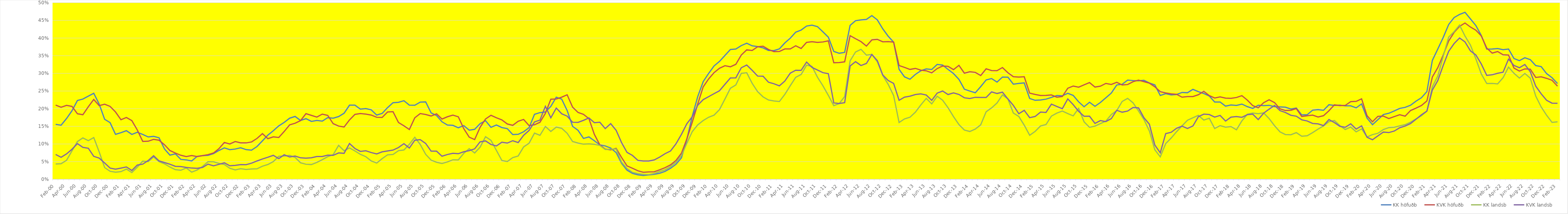
| Category | KK höfuðb | KVK höfuðb | KK landsb | KVK landsb |
|---|---|---|---|---|
| Feb-00 | 0.156 | 0.21 | 0.043 | 0.07 |
| Mar-00 | 0.153 | 0.204 | 0.044 | 0.062 |
| Apr-00 | 0.172 | 0.209 | 0.054 | 0.072 |
| May-00 | 0.194 | 0.206 | 0.081 | 0.085 |
| Jun-00 | 0.223 | 0.186 | 0.107 | 0.101 |
| Jul-00 | 0.227 | 0.183 | 0.117 | 0.09 |
| Aug-00 | 0.235 | 0.205 | 0.109 | 0.088 |
| Sep-00 | 0.244 | 0.226 | 0.118 | 0.065 |
| Oct-00 | 0.213 | 0.209 | 0.077 | 0.06 |
| Nov-00 | 0.17 | 0.213 | 0.033 | 0.046 |
| Dec-00 | 0.16 | 0.206 | 0.023 | 0.032 |
| Jan-01 | 0.127 | 0.191 | 0.02 | 0.029 |
| Feb-01 | 0.132 | 0.169 | 0.022 | 0.032 |
| Mar-01 | 0.138 | 0.175 | 0.029 | 0.035 |
| Apr-01 | 0.127 | 0.166 | 0.019 | 0.025 |
| May-01 | 0.133 | 0.14 | 0.034 | 0.04 |
| Jun-01 | 0.127 | 0.107 | 0.051 | 0.043 |
| Jul-01 | 0.12 | 0.108 | 0.05 | 0.053 |
| Aug-01 | 0.122 | 0.113 | 0.063 | 0.067 |
| Sep-01 | 0.118 | 0.111 | 0.05 | 0.052 |
| Oct-01 | 0.086 | 0.098 | 0.044 | 0.047 |
| Nov-01 | 0.068 | 0.081 | 0.035 | 0.043 |
| Dec-01 | 0.072 | 0.074 | 0.027 | 0.037 |
| Jan-02 | 0.056 | 0.068 | 0.026 | 0.036 |
| Feb-02 | 0.055 | 0.064 | 0.032 | 0.034 |
| Mar-02 | 0.052 | 0.067 | 0.02 | 0.032 |
| Apr-02 | 0.065 | 0.064 | 0.026 | 0.031 |
| May-02 | 0.067 | 0.067 | 0.037 | 0.034 |
| Jun-02 | 0.068 | 0.07 | 0.05 | 0.043 |
| Jul-02 | 0.073 | 0.074 | 0.05 | 0.038 |
| Aug-02 | 0.082 | 0.087 | 0.045 | 0.042 |
| Sep-02 | 0.089 | 0.104 | 0.042 | 0.047 |
| Oct-02 | 0.084 | 0.1 | 0.031 | 0.038 |
| Nov-02 | 0.086 | 0.107 | 0.027 | 0.039 |
| Dec-02 | 0.089 | 0.103 | 0.03 | 0.042 |
| Jan-03 | 0.084 | 0.103 | 0.028 | 0.042 |
| Feb-03 | 0.083 | 0.106 | 0.029 | 0.046 |
| Mar-03 | 0.093 | 0.116 | 0.03 | 0.052 |
| Apr-03 | 0.109 | 0.129 | 0.037 | 0.058 |
| May-03 | 0.125 | 0.115 | 0.042 | 0.062 |
| Jun-03 | 0.138 | 0.12 | 0.05 | 0.068 |
| Jul-03 | 0.151 | 0.118 | 0.065 | 0.059 |
| Aug-03 | 0.161 | 0.135 | 0.066 | 0.069 |
| Sep-03 | 0.173 | 0.154 | 0.068 | 0.063 |
| Oct-03 | 0.178 | 0.159 | 0.062 | 0.066 |
| Nov-03 | 0.167 | 0.166 | 0.047 | 0.061 |
| Dec-03 | 0.172 | 0.186 | 0.043 | 0.06 |
| Jan-04 | 0.164 | 0.181 | 0.042 | 0.061 |
| Feb-04 | 0.167 | 0.176 | 0.048 | 0.064 |
| Mar-04 | 0.165 | 0.185 | 0.056 | 0.065 |
| Apr-04 | 0.175 | 0.181 | 0.064 | 0.068 |
| May-04 | 0.173 | 0.158 | 0.07 | 0.068 |
| Jun-04 | 0.178 | 0.151 | 0.096 | 0.075 |
| Jul-04 | 0.187 | 0.148 | 0.081 | 0.074 |
| Aug-04 | 0.21 | 0.168 | 0.089 | 0.101 |
| Sep-04 | 0.21 | 0.184 | 0.08 | 0.087 |
| Oct-04 | 0.199 | 0.186 | 0.071 | 0.079 |
| Nov-04 | 0.2 | 0.185 | 0.064 | 0.081 |
| Dec-04 | 0.197 | 0.182 | 0.052 | 0.076 |
| Jan-05 | 0.182 | 0.176 | 0.046 | 0.072 |
| Feb-05 | 0.187 | 0.175 | 0.059 | 0.078 |
| Mar-05 | 0.203 | 0.191 | 0.069 | 0.08 |
| Apr-05 | 0.217 | 0.191 | 0.07 | 0.083 |
| May-05 | 0.218 | 0.161 | 0.081 | 0.09 |
| Jun-05 | 0.223 | 0.151 | 0.083 | 0.101 |
| Jul-05 | 0.21 | 0.141 | 0.099 | 0.089 |
| Aug-05 | 0.21 | 0.174 | 0.119 | 0.111 |
| Sep-05 | 0.219 | 0.186 | 0.099 | 0.112 |
| Oct-05 | 0.219 | 0.184 | 0.071 | 0.102 |
| Nov-05 | 0.188 | 0.179 | 0.054 | 0.08 |
| Dec-05 | 0.181 | 0.185 | 0.048 | 0.08 |
| Jan-06 | 0.163 | 0.171 | 0.045 | 0.065 |
| Feb-06 | 0.154 | 0.177 | 0.049 | 0.07 |
| Mar-06 | 0.153 | 0.182 | 0.055 | 0.074 |
| Apr-06 | 0.146 | 0.177 | 0.055 | 0.072 |
| May-06 | 0.152 | 0.143 | 0.074 | 0.078 |
| Jun-06 | 0.139 | 0.119 | 0.087 | 0.081 |
| Jul-06 | 0.142 | 0.113 | 0.075 | 0.086 |
| Aug-06 | 0.158 | 0.147 | 0.091 | 0.106 |
| Sep-06 | 0.166 | 0.171 | 0.121 | 0.109 |
| Oct-06 | 0.147 | 0.181 | 0.11 | 0.099 |
| Nov-06 | 0.154 | 0.174 | 0.082 | 0.094 |
| Dec-06 | 0.147 | 0.168 | 0.053 | 0.105 |
| Jan-07 | 0.143 | 0.157 | 0.05 | 0.103 |
| Feb-07 | 0.127 | 0.153 | 0.061 | 0.109 |
| Mar-07 | 0.127 | 0.164 | 0.066 | 0.104 |
| Apr-07 | 0.135 | 0.169 | 0.092 | 0.125 |
| May-07 | 0.146 | 0.152 | 0.102 | 0.138 |
| Jun-07 | 0.184 | 0.155 | 0.131 | 0.162 |
| Jul-07 | 0.189 | 0.161 | 0.124 | 0.168 |
| Aug-07 | 0.191 | 0.187 | 0.15 | 0.207 |
| Sep-07 | 0.207 | 0.227 | 0.136 | 0.174 |
| Oct-07 | 0.232 | 0.227 | 0.148 | 0.202 |
| Nov-07 | 0.227 | 0.233 | 0.144 | 0.186 |
| Dec-07 | 0.195 | 0.239 | 0.13 | 0.179 |
| Jan-08 | 0.15 | 0.204 | 0.107 | 0.162 |
| Feb-08 | 0.139 | 0.189 | 0.103 | 0.161 |
| Mar-08 | 0.116 | 0.184 | 0.099 | 0.167 |
| Apr-08 | 0.12 | 0.172 | 0.101 | 0.174 |
| May-08 | 0.109 | 0.127 | 0.099 | 0.16 |
| Jun-08 | 0.098 | 0.098 | 0.096 | 0.162 |
| Jul-08 | 0.094 | 0.085 | 0.084 | 0.144 |
| Aug-08 | 0.089 | 0.083 | 0.085 | 0.158 |
| Sep-08 | 0.076 | 0.088 | 0.086 | 0.139 |
| Oct-08 | 0.045 | 0.062 | 0.048 | 0.104 |
| Nov-08 | 0.026 | 0.038 | 0.03 | 0.076 |
| Dec-08 | 0.017 | 0.031 | 0.02 | 0.068 |
| Jan-09 | 0.013 | 0.024 | 0.016 | 0.054 |
| Feb-09 | 0.011 | 0.02 | 0.014 | 0.052 |
| Mar-09 | 0.012 | 0.021 | 0.013 | 0.052 |
| Apr-09 | 0.014 | 0.021 | 0.016 | 0.055 |
| May-09 | 0.017 | 0.027 | 0.022 | 0.063 |
| Jun-09 | 0.023 | 0.033 | 0.027 | 0.073 |
| Jul-09 | 0.031 | 0.041 | 0.036 | 0.08 |
| Aug-09 | 0.043 | 0.053 | 0.048 | 0.1 |
| Sep-09 | 0.061 | 0.074 | 0.067 | 0.127 |
| Oct-09 | 0.114 | 0.115 | 0.102 | 0.157 |
| Nov-09 | 0.179 | 0.162 | 0.135 | 0.177 |
| Dec-09 | 0.234 | 0.213 | 0.154 | 0.21 |
| Jan-10 | 0.277 | 0.262 | 0.166 | 0.226 |
| Feb-10 | 0.3 | 0.284 | 0.176 | 0.234 |
| Mar-10 | 0.321 | 0.302 | 0.182 | 0.243 |
| Apr-10 | 0.334 | 0.315 | 0.198 | 0.251 |
| May-10 | 0.351 | 0.322 | 0.227 | 0.269 |
| Jun-10 | 0.368 | 0.319 | 0.258 | 0.287 |
| Jul-10 | 0.369 | 0.326 | 0.267 | 0.287 |
| Aug-10 | 0.379 | 0.352 | 0.3 | 0.316 |
| Sep-10 | 0.385 | 0.367 | 0.302 | 0.324 |
| Oct-10 | 0.378 | 0.365 | 0.272 | 0.309 |
| Nov-10 | 0.376 | 0.375 | 0.248 | 0.293 |
| Dec-10 | 0.372 | 0.377 | 0.233 | 0.292 |
| Jan-11 | 0.365 | 0.368 | 0.225 | 0.275 |
| Feb-11 | 0.365 | 0.362 | 0.222 | 0.271 |
| Mar-11 | 0.369 | 0.362 | 0.22 | 0.265 |
| Apr-11 | 0.386 | 0.369 | 0.24 | 0.278 |
| May-11 | 0.4 | 0.369 | 0.265 | 0.301 |
| Jun-11 | 0.417 | 0.378 | 0.289 | 0.309 |
| Jul-11 | 0.423 | 0.37 | 0.297 | 0.308 |
| Aug-11 | 0.434 | 0.388 | 0.323 | 0.332 |
| Sep-11 | 0.436 | 0.39 | 0.32 | 0.317 |
| Oct-11 | 0.432 | 0.388 | 0.289 | 0.309 |
| Nov-11 | 0.418 | 0.389 | 0.265 | 0.302 |
| Dec-11 | 0.402 | 0.392 | 0.238 | 0.299 |
| Jan-12 | 0.362 | 0.33 | 0.209 | 0.216 |
| Feb-12 | 0.357 | 0.331 | 0.215 | 0.215 |
| Mar-12 | 0.359 | 0.333 | 0.234 | 0.217 |
| Apr-12 | 0.436 | 0.407 | 0.336 | 0.321 |
| May-12 | 0.449 | 0.398 | 0.361 | 0.333 |
| Jun-12 | 0.451 | 0.39 | 0.368 | 0.322 |
| Jul-12 | 0.453 | 0.377 | 0.352 | 0.328 |
| Aug-12 | 0.463 | 0.395 | 0.354 | 0.354 |
| Sep-12 | 0.452 | 0.396 | 0.333 | 0.336 |
| Oct-12 | 0.426 | 0.389 | 0.294 | 0.295 |
| Nov-12 | 0.405 | 0.39 | 0.269 | 0.28 |
| Dec-12 | 0.388 | 0.389 | 0.237 | 0.272 |
| Jan-13 | 0.312 | 0.322 | 0.161 | 0.224 |
| Feb-13 | 0.29 | 0.317 | 0.171 | 0.233 |
| Mar-13 | 0.283 | 0.311 | 0.176 | 0.235 |
| Apr-13 | 0.297 | 0.314 | 0.19 | 0.24 |
| May-13 | 0.307 | 0.309 | 0.211 | 0.242 |
| Jun-13 | 0.313 | 0.307 | 0.229 | 0.239 |
| Jul-13 | 0.311 | 0.301 | 0.214 | 0.224 |
| Aug-13 | 0.325 | 0.314 | 0.235 | 0.244 |
| Sep-13 | 0.323 | 0.321 | 0.224 | 0.25 |
| Oct-13 | 0.311 | 0.32 | 0.203 | 0.24 |
| Nov-13 | 0.3 | 0.311 | 0.178 | 0.245 |
| Dec-13 | 0.283 | 0.323 | 0.155 | 0.24 |
| Jan-14 | 0.255 | 0.301 | 0.139 | 0.231 |
| Feb-14 | 0.25 | 0.305 | 0.135 | 0.229 |
| Mar-14 | 0.245 | 0.303 | 0.142 | 0.232 |
| Apr-14 | 0.262 | 0.294 | 0.154 | 0.232 |
| May-14 | 0.281 | 0.313 | 0.191 | 0.232 |
| Jun-14 | 0.285 | 0.308 | 0.202 | 0.248 |
| Jul-14 | 0.275 | 0.308 | 0.216 | 0.243 |
| Aug-14 | 0.289 | 0.316 | 0.239 | 0.247 |
| Sep-14 | 0.289 | 0.302 | 0.227 | 0.228 |
| Oct-14 | 0.269 | 0.291 | 0.188 | 0.209 |
| Nov-14 | 0.272 | 0.289 | 0.178 | 0.186 |
| Dec-14 | 0.273 | 0.29 | 0.153 | 0.195 |
| Jan-15 | 0.229 | 0.244 | 0.125 | 0.174 |
| Feb-15 | 0.224 | 0.24 | 0.136 | 0.178 |
| Mar-15 | 0.225 | 0.237 | 0.151 | 0.19 |
| Apr-15 | 0.227 | 0.238 | 0.155 | 0.189 |
| May-15 | 0.232 | 0.239 | 0.179 | 0.213 |
| Jun-15 | 0.237 | 0.232 | 0.188 | 0.206 |
| Jul-15 | 0.236 | 0.234 | 0.193 | 0.2 |
| Aug-15 | 0.244 | 0.258 | 0.186 | 0.228 |
| Sep-15 | 0.238 | 0.264 | 0.18 | 0.211 |
| Oct-15 | 0.219 | 0.261 | 0.201 | 0.192 |
| Nov-15 | 0.206 | 0.268 | 0.163 | 0.178 |
| Dec-15 | 0.218 | 0.274 | 0.147 | 0.179 |
| Jan-16 | 0.207 | 0.261 | 0.151 | 0.158 |
| Feb-16 | 0.218 | 0.264 | 0.158 | 0.166 |
| Mar-16 | 0.231 | 0.272 | 0.165 | 0.163 |
| Apr-16 | 0.244 | 0.269 | 0.183 | 0.172 |
| May-16 | 0.267 | 0.275 | 0.194 | 0.195 |
| Jun-16 | 0.269 | 0.267 | 0.22 | 0.19 |
| Jul-16 | 0.281 | 0.268 | 0.229 | 0.193 |
| Aug-16 | 0.28 | 0.276 | 0.217 | 0.203 |
| Sep-16 | 0.279 | 0.281 | 0.193 | 0.202 |
| Oct-16 | 0.28 | 0.277 | 0.169 | 0.174 |
| Nov-16 | 0.273 | 0.272 | 0.137 | 0.156 |
| Dec-16 | 0.267 | 0.262 | 0.084 | 0.097 |
| Jan-17 | 0.237 | 0.248 | 0.064 | 0.075 |
| Feb-17 | 0.243 | 0.244 | 0.101 | 0.129 |
| Mar-17 | 0.239 | 0.242 | 0.117 | 0.133 |
| Apr-17 | 0.24 | 0.241 | 0.135 | 0.144 |
| May-17 | 0.246 | 0.233 | 0.151 | 0.151 |
| Jun-17 | 0.245 | 0.234 | 0.167 | 0.144 |
| Jul-17 | 0.255 | 0.234 | 0.174 | 0.151 |
| Aug-17 | 0.248 | 0.239 | 0.181 | 0.177 |
| Sep-17 | 0.243 | 0.249 | 0.168 | 0.184 |
| Oct-17 | 0.236 | 0.237 | 0.173 | 0.183 |
| Nov-17 | 0.219 | 0.23 | 0.144 | 0.176 |
| Dec-17 | 0.219 | 0.233 | 0.152 | 0.181 |
| Jan-18 | 0.207 | 0.23 | 0.148 | 0.165 |
| Feb-18 | 0.21 | 0.229 | 0.149 | 0.176 |
| Mar-18 | 0.209 | 0.232 | 0.14 | 0.178 |
| Apr-18 | 0.213 | 0.237 | 0.166 | 0.176 |
| May-18 | 0.206 | 0.224 | 0.184 | 0.183 |
| Jun-18 | 0.201 | 0.209 | 0.188 | 0.185 |
| Jul-18 | 0.21 | 0.202 | 0.186 | 0.169 |
| Aug-18 | 0.209 | 0.217 | 0.188 | 0.187 |
| Sep-18 | 0.21 | 0.225 | 0.172 | 0.199 |
| Oct-18 | 0.206 | 0.217 | 0.152 | 0.209 |
| Nov-18 | 0.205 | 0.199 | 0.134 | 0.194 |
| Dec-18 | 0.204 | 0.195 | 0.127 | 0.189 |
| Jan-19 | 0.199 | 0.195 | 0.126 | 0.181 |
| Feb-19 | 0.202 | 0.2 | 0.132 | 0.179 |
| Mar-19 | 0.182 | 0.178 | 0.122 | 0.168 |
| Apr-19 | 0.183 | 0.18 | 0.123 | 0.165 |
| May-19 | 0.196 | 0.182 | 0.132 | 0.158 |
| Jun-19 | 0.197 | 0.176 | 0.142 | 0.157 |
| Jul-19 | 0.195 | 0.18 | 0.151 | 0.152 |
| Aug-19 | 0.211 | 0.194 | 0.163 | 0.169 |
| Sep-19 | 0.209 | 0.211 | 0.167 | 0.161 |
| Oct-19 | 0.21 | 0.209 | 0.152 | 0.15 |
| Nov-19 | 0.208 | 0.209 | 0.141 | 0.147 |
| Dec-19 | 0.208 | 0.22 | 0.148 | 0.157 |
| Jan-20 | 0.202 | 0.221 | 0.134 | 0.142 |
| Feb-20 | 0.213 | 0.228 | 0.143 | 0.151 |
| mars.20* | 0.173 | 0.18 | 0.12 | 0.119 |
| Apr-20 | 0.155 | 0.163 | 0.126 | 0.112 |
| May-20 | 0.169 | 0.178 | 0.13 | 0.123 |
| Jun-20 | 0.183 | 0.179 | 0.141 | 0.134 |
| Jul-20 | 0.187 | 0.172 | 0.146 | 0.132 |
| Aug-20 | 0.194 | 0.178 | 0.147 | 0.137 |
| Sep-20 | 0.201 | 0.183 | 0.151 | 0.146 |
| Oct-20 | 0.204 | 0.179 | 0.155 | 0.151 |
| Nov-20 | 0.21 | 0.195 | 0.162 | 0.158 |
| Dec-20 | 0.221 | 0.202 | 0.171 | 0.17 |
| Jan-21 | 0.231 | 0.209 | 0.18 | 0.183 |
| Feb-21 | 0.248 | 0.222 | 0.193 | 0.193 |
| Mar-21 | 0.337 | 0.29 | 0.262 | 0.253 |
| Apr-21 | 0.369 | 0.316 | 0.292 | 0.279 |
| May-21 | 0.402 | 0.352 | 0.349 | 0.323 |
| Jun-21 | 0.438 | 0.392 | 0.403 | 0.362 |
| Jul-21 | 0.458 | 0.416 | 0.418 | 0.384 |
| Aug-21 | 0.467 | 0.433 | 0.437 | 0.4 |
| Sep-21 | 0.473 | 0.443 | 0.406 | 0.389 |
| Oct-21 | 0.454 | 0.431 | 0.38 | 0.364 |
| Nov-21 | 0.435 | 0.422 | 0.341 | 0.352 |
| Dec-21 | 0.407 | 0.406 | 0.298 | 0.326 |
| Jan-22 | 0.369 | 0.371 | 0.271 | 0.294 |
| Feb-22 | 0.369 | 0.357 | 0.271 | 0.296 |
| Mar-22 | 0.37 | 0.362 | 0.27 | 0.3 |
| Apr-22 | 0.367 | 0.353 | 0.288 | 0.303 |
| May-22 | 0.369 | 0.352 | 0.318 | 0.341 |
| Jun-22 | 0.342 | 0.315 | 0.3 | 0.322 |
| Jul-22 | 0.336 | 0.306 | 0.287 | 0.316 |
| Aug-22 | 0.344 | 0.313 | 0.3 | 0.325 |
| Sep-22 | 0.339 | 0.312 | 0.286 | 0.305 |
| Oct-22 | 0.322 | 0.288 | 0.236 | 0.264 |
| Nov-22 | 0.319 | 0.29 | 0.205 | 0.242 |
| Dec-22 | 0.299 | 0.286 | 0.181 | 0.224 |
| Jan-23 | 0.288 | 0.28 | 0.161 | 0.216 |
| Feb-23 | 0.271 | 0.264 | 0.163 | 0.215 |